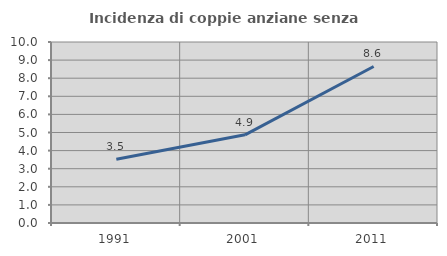
| Category | Incidenza di coppie anziane senza figli  |
|---|---|
| 1991.0 | 3.526 |
| 2001.0 | 4.871 |
| 2011.0 | 8.648 |